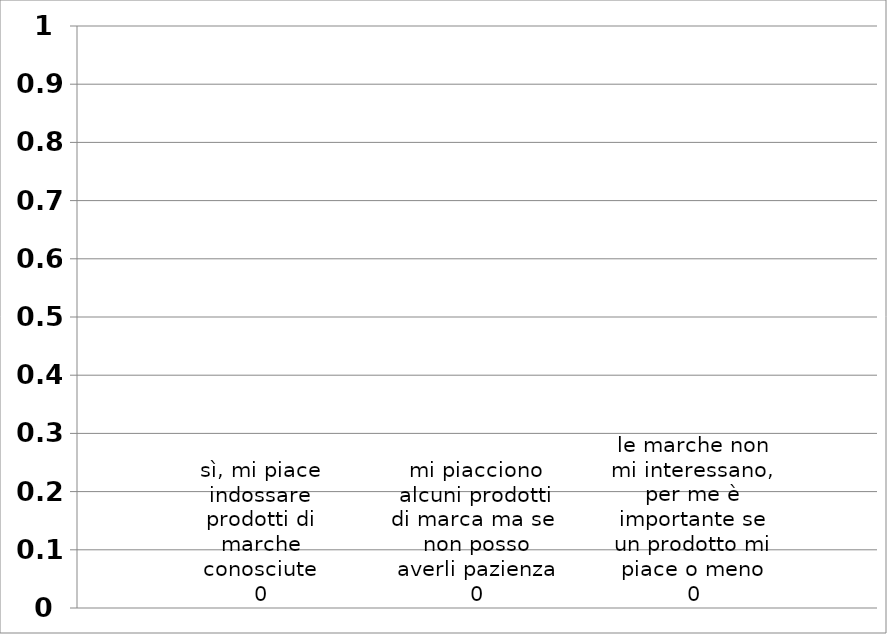
| Category | sì, mi piace indossare prodotti di marche conosciute | mi piacciono alcuni prodotti di marca ma se  non posso averli pazienza | le marche non mi interessano, per me è importante se un prodotto mi piace o meno |
|---|---|---|---|
| 0 | 0 | 0 | 0 |